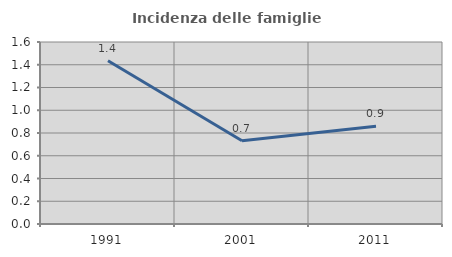
| Category | Incidenza delle famiglie numerose |
|---|---|
| 1991.0 | 1.434 |
| 2001.0 | 0.732 |
| 2011.0 | 0.858 |